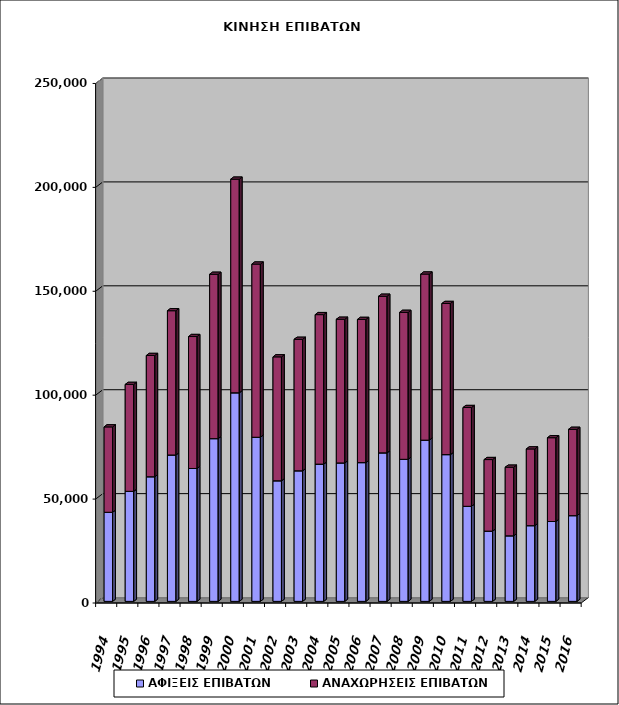
| Category | ΑΦΙΞΕΙΣ ΕΠΙΒΑΤΩΝ | ΑΝΑΧΩΡΗΣΕΙΣ ΕΠΙΒΑΤΩΝ |
|---|---|---|
| 1994.0 | 42867 | 41085 |
| 1995.0 | 52951 | 51434 |
| 1996.0 | 59966 | 58347 |
| 1997.0 | 70441 | 69414 |
| 1998.0 | 63941 | 63494 |
| 1999.0 | 78306 | 79077 |
| 2000.0 | 100364 | 102786 |
| 2001.0 | 78970 | 83327 |
| 2002.0 | 58025 | 59628 |
| 2003.0 | 62829 | 63261 |
| 2004.0 | 66038 | 71935 |
| 2005.0 | 66623 | 69114 |
| 2006.0 | 66762 | 68893 |
| 2007.0 | 71463 | 75343 |
| 2008.0 | 68354 | 70710 |
| 2009.0 | 77576 | 79914 |
| 2010.0 | 70613 | 72720 |
| 2011.0 | 45742 | 47529 |
| 2012.0 | 33792 | 34440 |
| 2013.0 | 31542 | 33003 |
| 2014.0 | 36423 | 36917 |
| 2015.0 | 38435 | 40310 |
| 2016.0 | 41241 | 41534 |